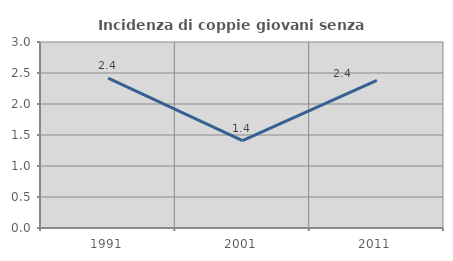
| Category | Incidenza di coppie giovani senza figli |
|---|---|
| 1991.0 | 2.416 |
| 2001.0 | 1.408 |
| 2011.0 | 2.381 |